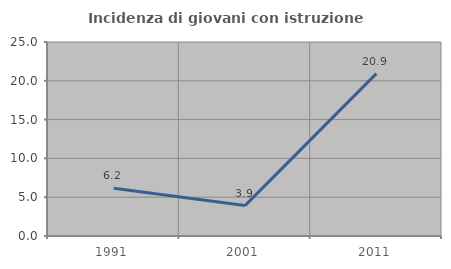
| Category | Incidenza di giovani con istruzione universitaria |
|---|---|
| 1991.0 | 6.154 |
| 2001.0 | 3.922 |
| 2011.0 | 20.93 |